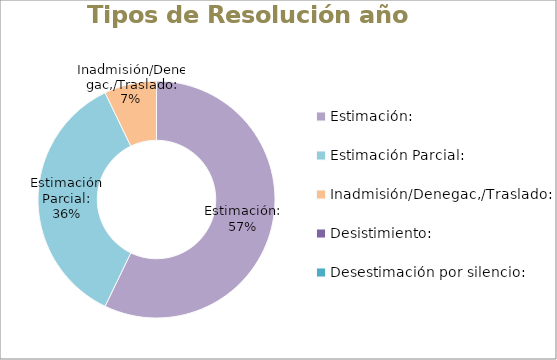
| Category | Series 0 |
|---|---|
| Estimación: | 0.571 |
| Estimación Parcial: | 0.357 |
| Inadmisión/Denegac,/Traslado: | 0.071 |
| Desistimiento: | 0 |
| Desestimación por silencio: | 0 |